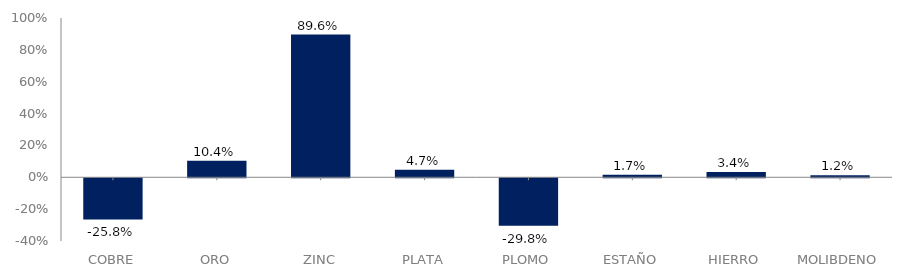
| Category | Series 0 |
|---|---|
| COBRE | -0.258 |
| ORO | 0.104 |
| ZINC | 0.896 |
| PLATA | 0.047 |
| PLOMO | -0.298 |
| ESTAÑO | 0.017 |
| HIERRO | 0.034 |
| MOLIBDENO | 0.012 |